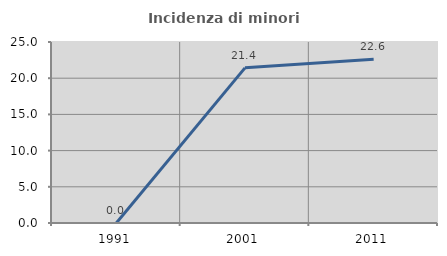
| Category | Incidenza di minori stranieri |
|---|---|
| 1991.0 | 0 |
| 2001.0 | 21.429 |
| 2011.0 | 22.619 |